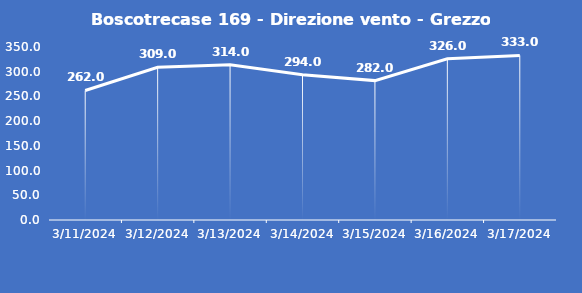
| Category | Boscotrecase 169 - Direzione vento - Grezzo (°N) |
|---|---|
| 3/11/24 | 262 |
| 3/12/24 | 309 |
| 3/13/24 | 314 |
| 3/14/24 | 294 |
| 3/15/24 | 282 |
| 3/16/24 | 326 |
| 3/17/24 | 333 |